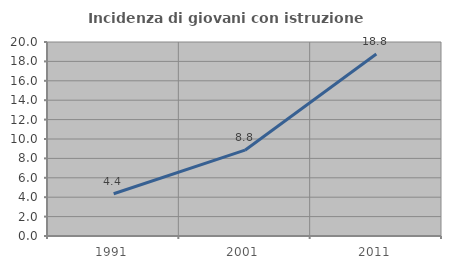
| Category | Incidenza di giovani con istruzione universitaria |
|---|---|
| 1991.0 | 4.359 |
| 2001.0 | 8.848 |
| 2011.0 | 18.759 |